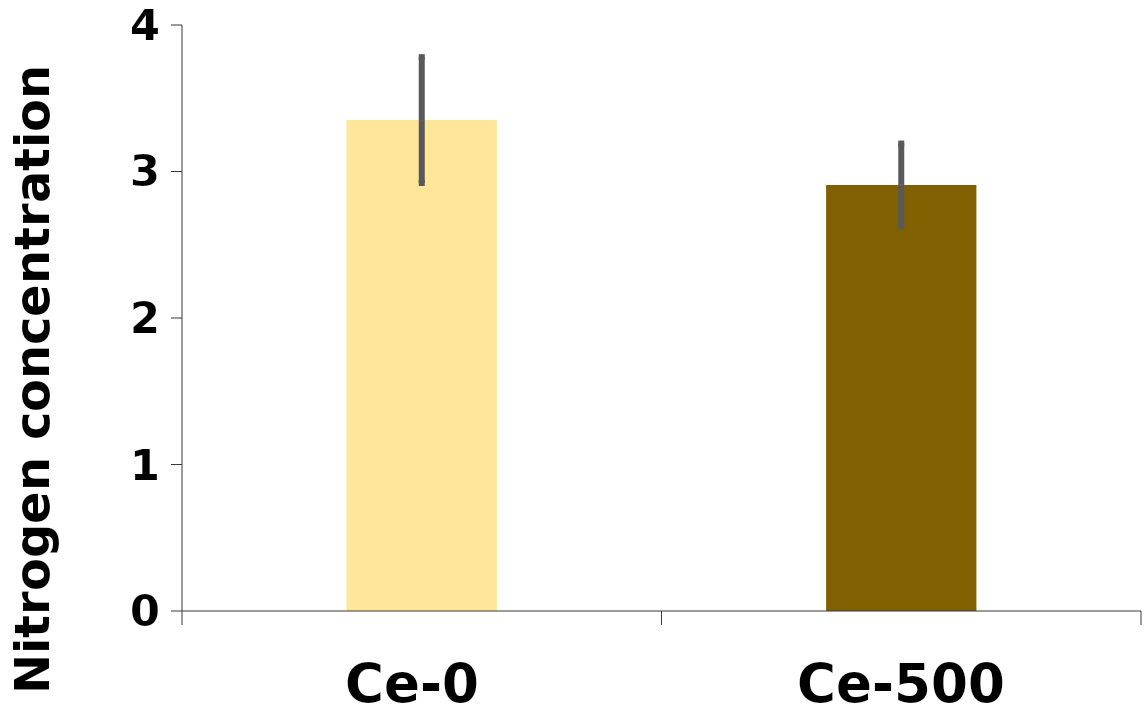
| Category | %N |
|---|---|
| Ce-0 | 3.351 |
| Ce-500 | 2.908 |